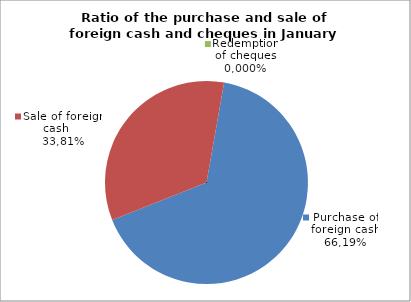
| Category | Purchase of foreign cash |
|---|---|
| 0 | 66.194 |
| 1 | 33.806 |
| 2 | 0 |